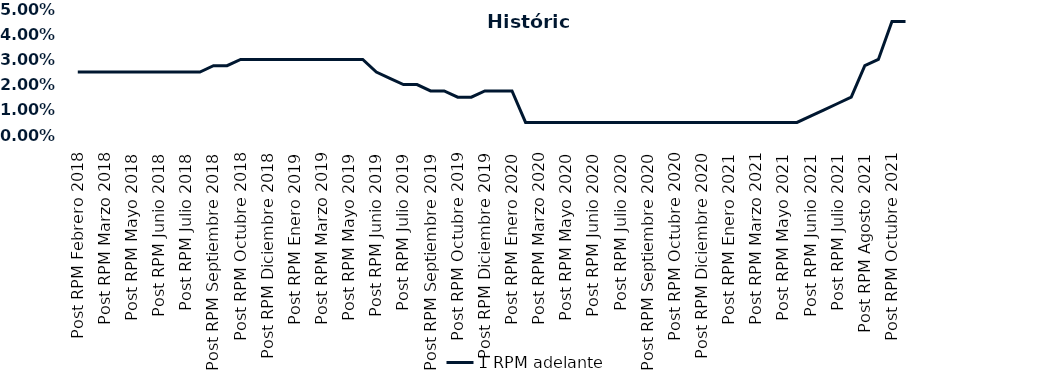
| Category | 1 RPM adelante |
|---|---|
| Post RPM Febrero 2018 | 0.025 |
| Pre RPM Marzo 2018 | 0.025 |
| Post RPM Marzo 2018 | 0.025 |
| Pre RPM Mayo 2018 | 0.025 |
| Post RPM Mayo 2018 | 0.025 |
| Pre RPM Junio 2018 | 0.025 |
| Post RPM Junio 2018 | 0.025 |
| Pre RPM Julio 2018 | 0.025 |
| Post RPM Julio 2018 | 0.025 |
| Pre RPM Septiembre 2018 | 0.025 |
| Post RPM Septiembre 2018 | 0.028 |
| Pre RPM Octubre 2018 | 0.028 |
| Post RPM Octubre 2018 | 0.03 |
| Pre RPM Diciembre 2018 | 0.03 |
| Post RPM Diciembre 2018 | 0.03 |
| Pre RPM Enero 2019 | 0.03 |
| Post RPM Enero 2019 | 0.03 |
| Pre RPM Marzo 2019 | 0.03 |
| Post RPM Marzo 2019 | 0.03 |
| Pre RPM Mayo 2019 | 0.03 |
| Post RPM Mayo 2019 | 0.03 |
| Pre RPM Junio 2019 | 0.03 |
| Post RPM Junio 2019 | 0.025 |
| Pre RPM Julio 2019 | 0.022 |
| Post RPM Julio 2019 | 0.02 |
| Pre RPM Septiembre 2019 | 0.02 |
| Post RPM Septiembre 2019 | 0.018 |
| Pre RPM Octubre 2019 | 0.018 |
| Post RPM Octubre 2019 | 0.015 |
| Pre RPM Diciembre 2019 | 0.015 |
| Post RPM Diciembre 2019 | 0.018 |
| Pre RPM Enero 2020 | 0.018 |
| Post RPM Enero 2020 | 0.018 |
| Pre RPM Marzo 2020 | 0.005 |
| Post RPM Marzo 2020 | 0.005 |
| Pre RPM Mayo 2020 | 0.005 |
| Post RPM Mayo 2020 | 0.005 |
| Pre RPM Junio 2020 | 0.005 |
| Post RPM Junio 2020 | 0.005 |
| Pre RPM Julio 2020 | 0.005 |
| Post RPM Julio 2020 | 0.005 |
| Pre RPM Septiembre 2020 | 0.005 |
| Post RPM Septiembre 2020 | 0.005 |
| Pre RPM Octubre 2020 | 0.005 |
| Post RPM Octubre 2020 | 0.005 |
| Pre RPM Diciembre 2020 | 0.005 |
| Post RPM Diciembre 2020 | 0.005 |
| Pre RPM Enero 2021 | 0.005 |
| Post RPM Enero 2021 | 0.005 |
| Pre RPM Marzo 2021 | 0.005 |
| Post RPM Marzo 2021 | 0.005 |
| Pre RPM Mayo 2021 | 0.005 |
| Post RPM Mayo 2021 | 0.005 |
| Pre RPM Junio 2021 | 0.005 |
| Post RPM Junio 2021 | 0.008 |
| Pre RPM Julio 2021 | 0.01 |
| Post RPM Julio 2021 | 0.012 |
| Pre RPM Agosto 2021 | 0.015 |
| Post RPM Agosto 2021 | 0.028 |
| Pre RPM Octubre 2021 | 0.03 |
| Post RPM Octubre 2021 | 0.045 |
| Pre RPM Diciembre 2021 | 0.045 |